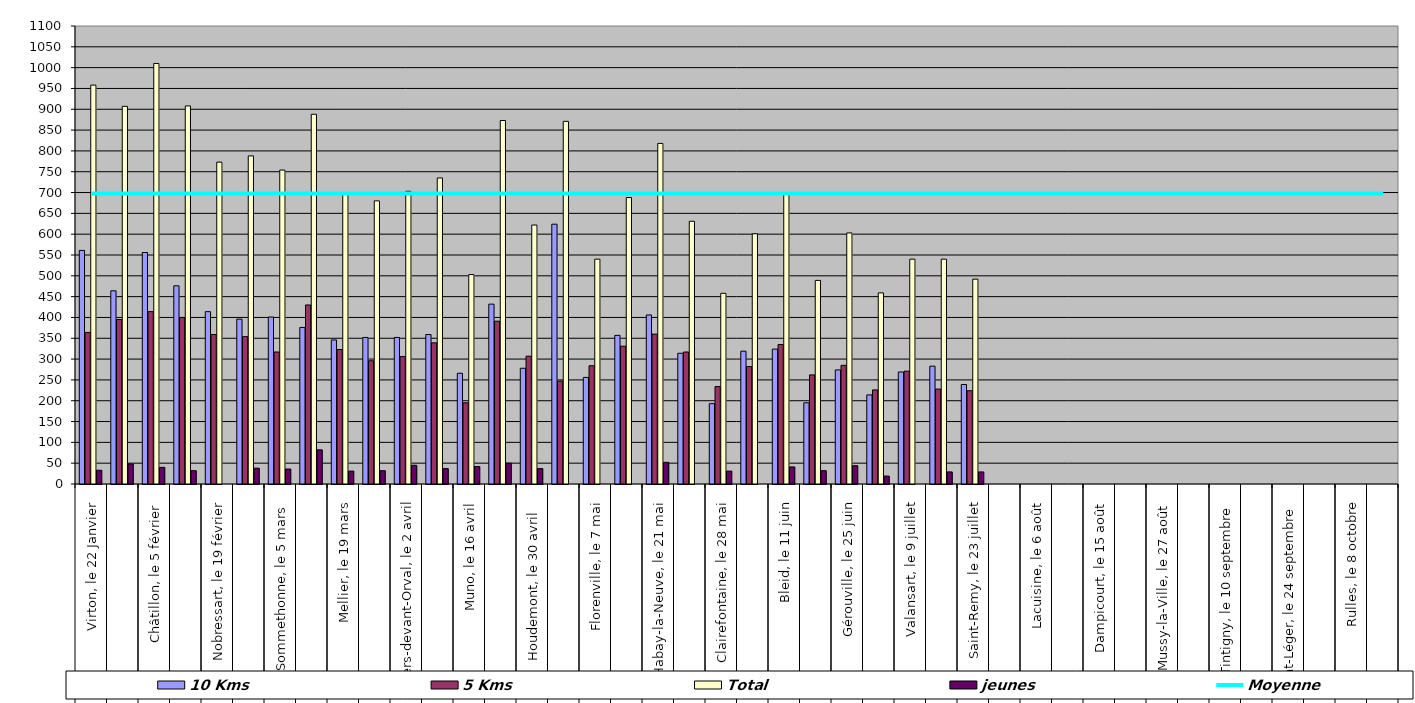
| Category | 10 Kms | 5 Kms | Total | jeunes |
|---|---|---|---|---|
| 0 | 561 | 364 | 958 | 33 |
| 1 | 464 | 395 | 907 | 48 |
| 2 | 556 | 414 | 1010 | 40 |
| 3 | 476 | 400 | 908 | 32 |
| 4 | 414 | 359 | 773 | 0 |
| 5 | 396 | 354 | 788 | 38 |
| 6 | 401 | 317 | 754 | 36 |
| 7 | 376 | 430 | 888 | 82 |
| 8 | 346 | 323 | 700 | 31 |
| 9 | 352 | 296 | 680 | 32 |
| 10 | 352 | 306 | 703 | 45 |
| 11 | 359 | 339 | 735 | 37 |
| 12 | 266 | 195 | 503 | 42 |
| 13 | 432 | 391 | 873 | 50 |
| 14 | 278 | 307 | 622 | 37 |
| 15 | 624 | 247 | 871 | 0 |
| 16 | 256 | 284 | 540 | 0 |
| 17 | 357 | 331 | 688 | 0 |
| 18 | 406 | 360 | 818 | 52 |
| 19 | 314 | 317 | 631 | 0 |
| 20 | 193 | 234 | 458 | 31 |
| 21 | 319 | 282 | 601 | 0 |
| 22 | 324 | 335 | 700 | 41 |
| 23 | 195 | 262 | 489 | 32 |
| 24 | 274 | 285 | 603 | 44 |
| 25 | 214 | 226 | 459 | 19 |
| 26 | 269 | 271 | 540 | 0 |
| 27 | 283 | 228 | 540 | 29 |
| 28 | 239 | 224 | 492 | 29 |
| 29 | 0 | 0 | 0 | 0 |
| 30 | 0 | 0 | 0 | 0 |
| 31 | 0 | 0 | 0 | 0 |
| 32 | 0 | 0 | 0 | 0 |
| 33 | 0 | 0 | 0 | 0 |
| 34 | 0 | 0 | 0 | 0 |
| 35 | 0 | 0 | 0 | 0 |
| 36 | 0 | 0 | 0 | 0 |
| 37 | 0 | 0 | 0 | 0 |
| 38 | 0 | 0 | 0 | 0 |
| 39 | 0 | 0 | 0 | 0 |
| 40 | 0 | 0 | 0 | 0 |
| 41 | 0 | 0 | 0 | 0 |